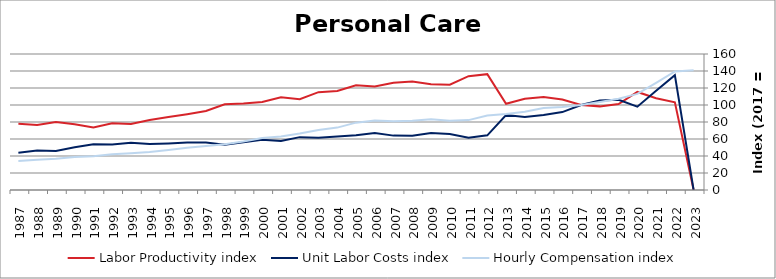
| Category | Labor Productivity index | Unit Labor Costs index | Hourly Compensation index |
|---|---|---|---|
| 2023.0 | 0 | 0 | 140.756 |
| 2022.0 | 103.254 | 135.152 | 139.55 |
| 2021.0 | 107.981 | 116.689 | 126.003 |
| 2020.0 | 115.33 | 97.996 | 113.019 |
| 2019.0 | 101.098 | 106.154 | 107.319 |
| 2018.0 | 98.386 | 105.323 | 103.623 |
| 2017.0 | 100 | 100 | 100 |
| 2016.0 | 106.433 | 91.69 | 97.588 |
| 2015.0 | 109.421 | 88.132 | 96.434 |
| 2014.0 | 107.32 | 85.851 | 92.136 |
| 2013.0 | 101.5 | 88.185 | 89.508 |
| 2012.0 | 136.314 | 64.281 | 87.624 |
| 2011.0 | 133.89 | 61.41 | 82.222 |
| 2010.0 | 123.941 | 65.823 | 81.581 |
| 2009.0 | 124.338 | 67.014 | 83.324 |
| 2008.0 | 127.604 | 63.776 | 81.38 |
| 2007.0 | 126.23 | 63.977 | 80.758 |
| 2006.0 | 121.884 | 67.034 | 81.704 |
| 2005.0 | 123.095 | 64.362 | 79.227 |
| 2004.0 | 116.502 | 63.017 | 73.416 |
| 2003.0 | 115.076 | 61.436 | 70.698 |
| 2002.0 | 106.753 | 62.192 | 66.392 |
| 2001.0 | 109.017 | 57.791 | 63.002 |
| 2000.0 | 103.487 | 59.152 | 61.215 |
| 1999.0 | 101.697 | 56.104 | 57.056 |
| 1998.0 | 100.899 | 53.282 | 53.761 |
| 1997.0 | 92.868 | 55.752 | 51.776 |
| 1996.0 | 89.178 | 55.8 | 49.761 |
| 1995.0 | 85.872 | 54.816 | 47.072 |
| 1994.0 | 82.403 | 54.112 | 44.59 |
| 1993.0 | 77.643 | 55.56 | 43.138 |
| 1992.0 | 78.382 | 53.631 | 42.037 |
| 1991.0 | 73.439 | 53.898 | 39.582 |
| 1990.0 | 77.427 | 50.19 | 38.86 |
| 1989.0 | 79.981 | 46.014 | 36.803 |
| 1988.0 | 76.491 | 46.375 | 35.472 |
| 1987.0 | 77.844 | 43.862 | 34.144 |